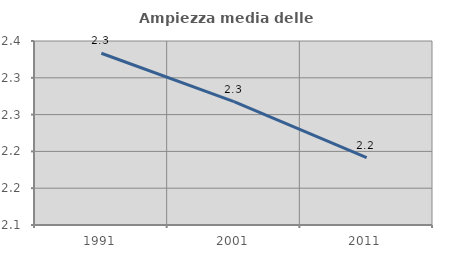
| Category | Ampiezza media delle famiglie |
|---|---|
| 1991.0 | 2.333 |
| 2001.0 | 2.268 |
| 2011.0 | 2.192 |